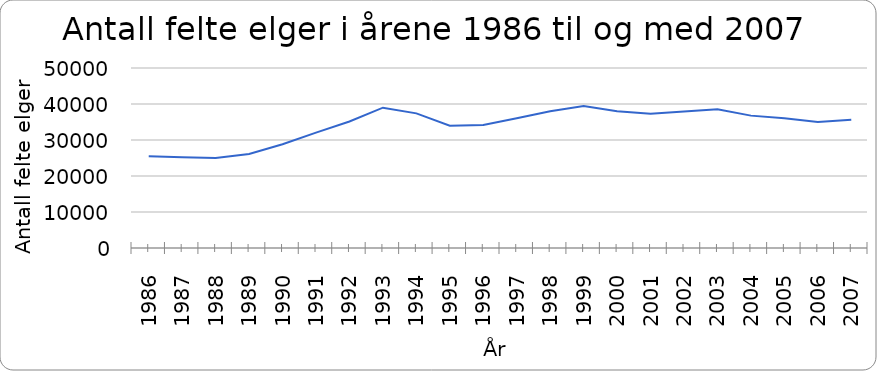
| Category | Antall felte elger |
|---|---|
| 1986.0 | 25511 |
| 1987.0 | 25199 |
| 1988.0 | 24972 |
| 1989.0 | 26127 |
| 1990.0 | 28841 |
| 1991.0 | 32053 |
| 1992.0 | 35145 |
| 1993.0 | 38980 |
| 1994.0 | 37401 |
| 1995.0 | 33955 |
| 1996.0 | 34141 |
| 1997.0 | 36059 |
| 1998.0 | 37957 |
| 1999.0 | 39423 |
| 2000.0 | 38000 |
| 2001.0 | 37300 |
| 2002.0 | 37892 |
| 2003.0 | 38564 |
| 2004.0 | 36770 |
| 2005.0 | 36026 |
| 2006.0 | 34978 |
| 2007.0 | 35657 |